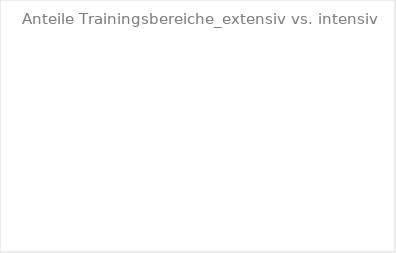
| Category | Series 0 |
|---|---|
| extensiv | 0 |
| intensiv | 0 |